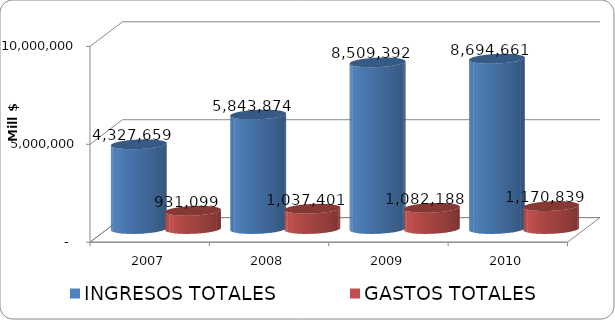
| Category | INGRESOS TOTALES | GASTOS TOTALES |
|---|---|---|
| 2007 | 4327658.775 | 931099.204 |
| 2008 | 5843873.786 | 1037401.381 |
| 2009 | 8509392.476 | 1082188.303 |
| 2010 | 8694661 | 1170839 |